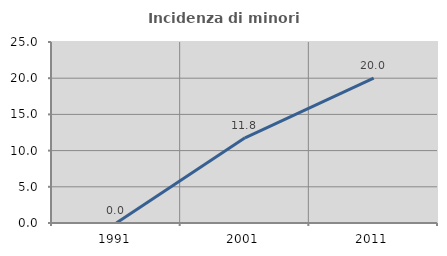
| Category | Incidenza di minori stranieri |
|---|---|
| 1991.0 | 0 |
| 2001.0 | 11.765 |
| 2011.0 | 20 |